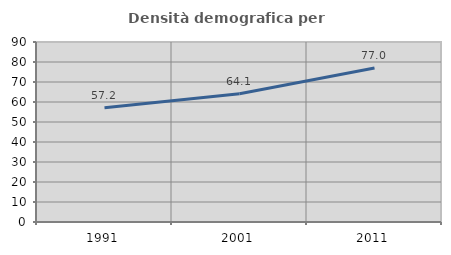
| Category | Densità demografica |
|---|---|
| 1991.0 | 57.154 |
| 2001.0 | 64.1 |
| 2011.0 | 77.026 |